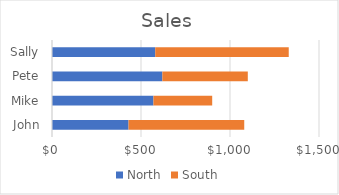
| Category | North | South |
|---|---|---|
| John | 430 | 650 |
| Mike | 570 | 330 |
| Pete | 620 | 480 |
| Sally | 580 | 750 |